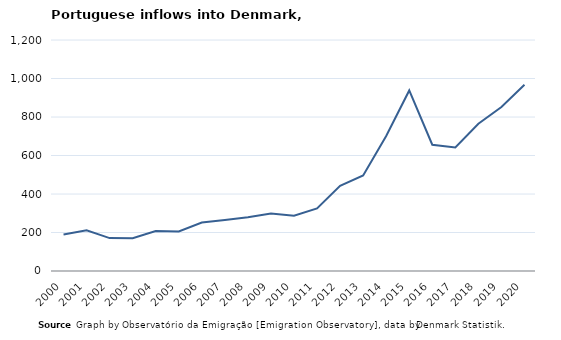
| Category | Entradas |
|---|---|
| 2000.0 | 190 |
| 2001.0 | 211 |
| 2002.0 | 171 |
| 2003.0 | 170 |
| 2004.0 | 208 |
| 2005.0 | 205 |
| 2006.0 | 252 |
| 2007.0 | 265 |
| 2008.0 | 279 |
| 2009.0 | 299 |
| 2010.0 | 287 |
| 2011.0 | 325 |
| 2012.0 | 443 |
| 2013.0 | 496 |
| 2014.0 | 701 |
| 2015.0 | 938 |
| 2016.0 | 656 |
| 2017.0 | 642 |
| 2018.0 | 765 |
| 2019.0 | 852 |
| 2020.0 | 968 |